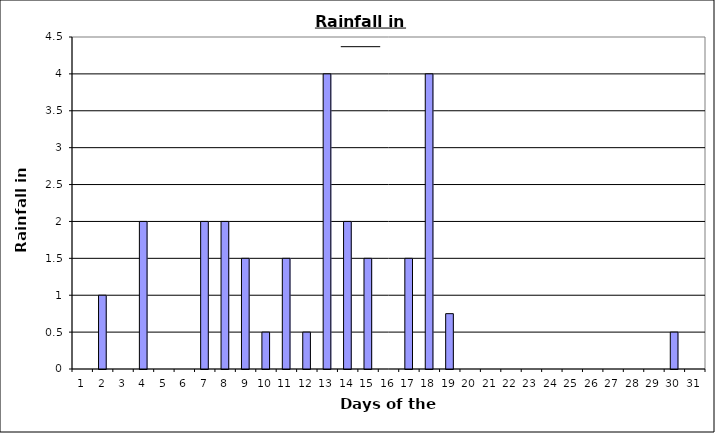
| Category | Series 0 |
|---|---|
| 0 | 0 |
| 1 | 1 |
| 2 | 0 |
| 3 | 2 |
| 4 | 0 |
| 5 | 0 |
| 6 | 2 |
| 7 | 2 |
| 8 | 1.5 |
| 9 | 0.5 |
| 10 | 1.5 |
| 11 | 0.5 |
| 12 | 4 |
| 13 | 2 |
| 14 | 1.5 |
| 15 | 0 |
| 16 | 1.5 |
| 17 | 4 |
| 18 | 0.75 |
| 19 | 0 |
| 20 | 0 |
| 21 | 0 |
| 22 | 0 |
| 23 | 0 |
| 24 | 0 |
| 25 | 0 |
| 26 | 0 |
| 27 | 0 |
| 28 | 0 |
| 29 | 0.5 |
| 30 | 0 |